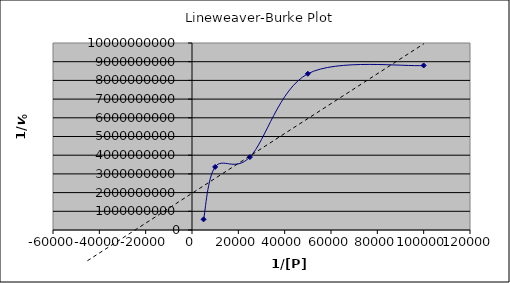
| Category | vo |
|---|---|
| 99999.99999999999 | 8797952127.114 |
| 49999.99999999999 | 8353998831.738 |
| 24999.999999999996 | 3899578588.482 |
| 10000.0 | 3373122098.193 |
| 5000.0 | 569025139.461 |